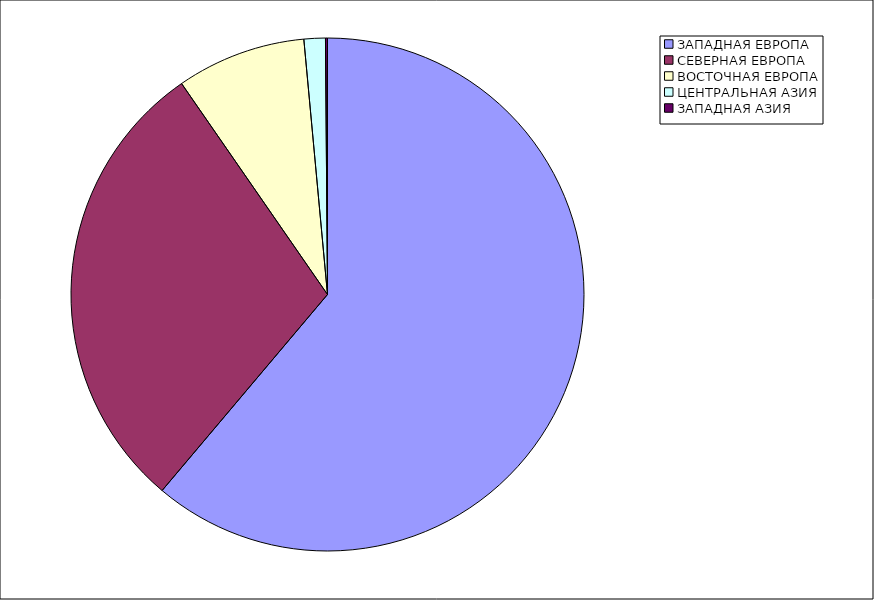
| Category | Оборот |
|---|---|
| ЗАПАДНАЯ ЕВРОПА | 61.155 |
| СЕВЕРНАЯ ЕВРОПА | 29.213 |
| ВОСТОЧНАЯ ЕВРОПА | 8.159 |
| ЦЕНТРАЛЬНАЯ АЗИЯ | 1.346 |
| ЗАПАДНАЯ АЗИЯ | 0.126 |